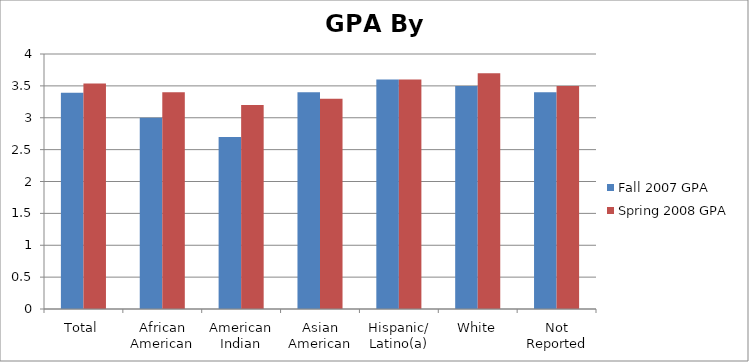
| Category | Fall 2007 GPA | Spring 2008 GPA |
|---|---|---|
| Total | 3.393 | 3.538 |
| African American | 3 | 3.4 |
| American Indian | 2.7 | 3.2 |
| Asian American | 3.4 | 3.3 |
| Hispanic/ Latino(a) | 3.6 | 3.6 |
| White | 3.5 | 3.7 |
| Not Reported | 3.4 | 3.5 |